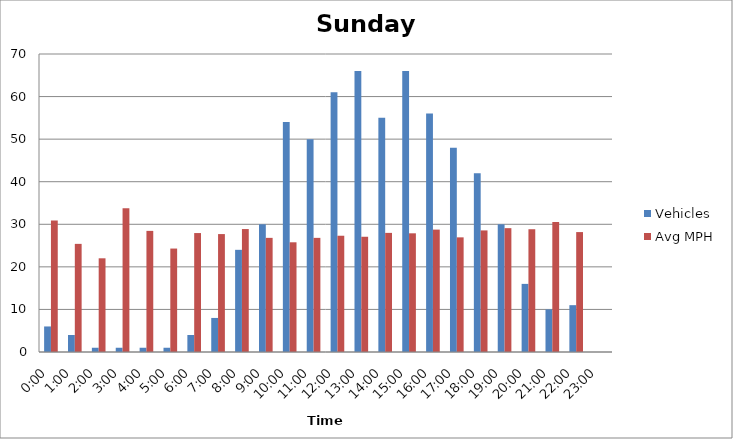
| Category | Vehicles | Avg MPH |
|---|---|---|
| 0:00 | 6 | 30.9 |
| 1:00 | 4 | 25.4 |
| 2:00 | 1 | 22.01 |
| 3:00 | 1 | 33.77 |
| 4:00 | 1 | 28.45 |
| 5:00 | 1 | 24.3 |
| 6:00 | 4 | 27.94 |
| 7:00 | 8 | 27.7 |
| 8:00 | 24 | 28.88 |
| 9:00 | 30 | 26.81 |
| 10:00 | 54 | 25.77 |
| 11:00 | 50 | 26.81 |
| 12:00 | 61 | 27.31 |
| 13:00 | 66 | 27.07 |
| 14:00 | 55 | 27.98 |
| 15:00 | 66 | 27.88 |
| 16:00 | 56 | 28.75 |
| 17:00 | 48 | 26.93 |
| 18:00 | 42 | 28.56 |
| 19:00 | 30 | 29.09 |
| 20:00 | 16 | 28.84 |
| 21:00 | 10 | 30.55 |
| 22:00 | 11 | 28.17 |
| 23:00 | 0 | 0 |